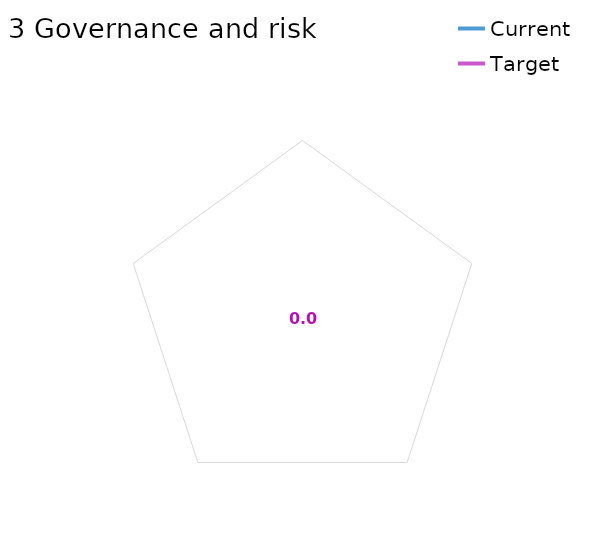
| Category | Current | Target |
|---|---|---|
| 0 | 0 | 0 |
| 1 | 0 | 0 |
| 2 | 0 | 0 |
| 3 | 0 | 0 |
| 4 | 0 | 0 |